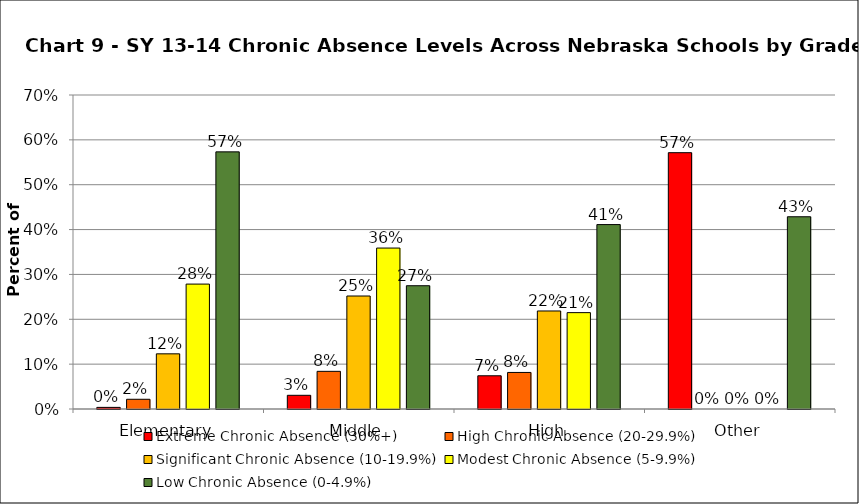
| Category | Extreme Chronic Absence (30%+) | High Chronic Absence (20-29.9%) | Significant Chronic Absence (10-19.9%) | Modest Chronic Absence (5-9.9%) | Low Chronic Absence (0-4.9%) |
|---|---|---|---|---|---|
| 0 | 0.004 | 0.022 | 0.123 | 0.278 | 0.573 |
| 1 | 0.031 | 0.084 | 0.252 | 0.359 | 0.275 |
| 2 | 0.074 | 0.081 | 0.219 | 0.215 | 0.411 |
| 3 | 0.571 | 0 | 0 | 0 | 0.429 |